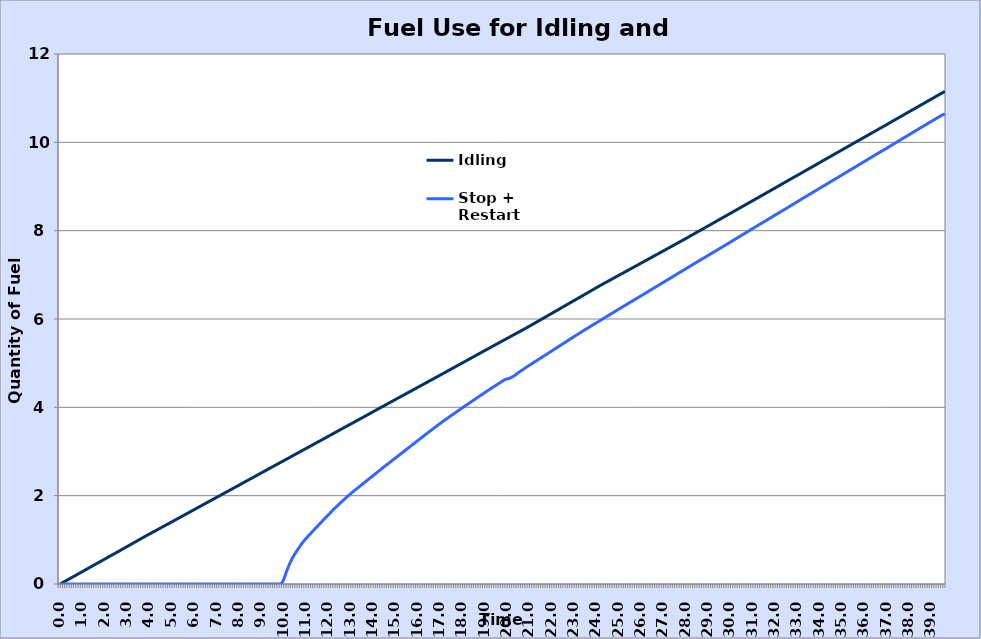
| Category | Idling | Stop + Restart |
|---|---|---|
| 0.0 | 0 | 0 |
| 0.1 | 0.028 | 0 |
| 0.2 | 0.056 | 0 |
| 0.3 | 0.084 | 0 |
| 0.4 | 0.112 | 0 |
| 0.5 | 0.14 | 0 |
| 0.6 | 0.168 | 0 |
| 0.7 | 0.196 | 0 |
| 0.8 | 0.225 | 0 |
| 0.9 | 0.253 | 0 |
| 1.0 | 0.282 | 0 |
| 1.1 | 0.31 | 0 |
| 1.2 | 0.339 | 0 |
| 1.3 | 0.367 | 0 |
| 1.4 | 0.396 | 0 |
| 1.5 | 0.424 | 0 |
| 1.6 | 0.452 | 0 |
| 1.7 | 0.48 | 0 |
| 1.8 | 0.509 | 0 |
| 1.9 | 0.536 | 0 |
| 2.0 | 0.565 | 0 |
| 2.1 | 0.593 | 0 |
| 2.2 | 0.621 | 0 |
| 2.3 | 0.65 | 0 |
| 2.4 | 0.678 | 0 |
| 2.5 | 0.706 | 0 |
| 2.6 | 0.734 | 0 |
| 2.7 | 0.762 | 0 |
| 2.8 | 0.791 | 0 |
| 2.9 | 0.82 | 0 |
| 3.0 | 0.849 | 0 |
| 3.1 | 0.877 | 0 |
| 3.2 | 0.906 | 0 |
| 3.3 | 0.934 | 0 |
| 3.4 | 0.963 | 0 |
| 3.5 | 0.991 | 0 |
| 3.6 | 1.019 | 0 |
| 3.7 | 1.048 | 0 |
| 3.8 | 1.077 | 0 |
| 3.9 | 1.105 | 0 |
| 4.0 | 1.132 | 0 |
| 4.1 | 1.16 | 0 |
| 4.2 | 1.187 | 0 |
| 4.3 | 1.214 | 0 |
| 4.4 | 1.242 | 0 |
| 4.5 | 1.269 | 0 |
| 4.6 | 1.296 | 0 |
| 4.7 | 1.324 | 0 |
| 4.8 | 1.352 | 0 |
| 4.9 | 1.379 | 0 |
| 5.0 | 1.407 | 0 |
| 5.1 | 1.435 | 0 |
| 5.2 | 1.462 | 0 |
| 5.3 | 1.49 | 0 |
| 5.4 | 1.517 | 0 |
| 5.5 | 1.545 | 0 |
| 5.6 | 1.572 | 0 |
| 5.7 | 1.6 | 0 |
| 5.8 | 1.628 | 0 |
| 5.9 | 1.656 | 0 |
| 6.0 | 1.684 | 0 |
| 6.1 | 1.712 | 0 |
| 6.2 | 1.739 | 0 |
| 6.3 | 1.767 | 0 |
| 6.4 | 1.794 | 0 |
| 6.50000000000001 | 1.822 | 0 |
| 6.6 | 1.85 | 0 |
| 6.7 | 1.878 | 0 |
| 6.80000000000001 | 1.905 | 0 |
| 6.90000000000001 | 1.932 | 0 |
| 7.00000000000001 | 1.96 | 0 |
| 7.1 | 1.988 | 0 |
| 7.20000000000001 | 2.015 | 0 |
| 7.30000000000001 | 2.043 | 0 |
| 7.40000000000001 | 2.07 | 0 |
| 7.50000000000001 | 2.098 | 0 |
| 7.60000000000001 | 2.126 | 0 |
| 7.70000000000001 | 2.153 | 0 |
| 7.80000000000001 | 2.181 | 0 |
| 7.90000000000001 | 2.208 | 0 |
| 8.00000000000001 | 2.236 | 0 |
| 8.10000000000001 | 2.264 | 0 |
| 8.20000000000001 | 2.292 | 0 |
| 8.30000000000001 | 2.32 | 0 |
| 8.40000000000001 | 2.348 | 0 |
| 8.50000000000001 | 2.376 | 0 |
| 8.60000000000001 | 2.403 | 0 |
| 8.70000000000001 | 2.43 | 0 |
| 8.80000000000001 | 2.458 | 0 |
| 8.90000000000001 | 2.485 | 0 |
| 9.00000000000001 | 2.513 | 0 |
| 9.10000000000001 | 2.541 | 0 |
| 9.20000000000001 | 2.569 | 0 |
| 9.30000000000001 | 2.597 | 0 |
| 9.40000000000001 | 2.624 | 0 |
| 9.50000000000001 | 2.652 | 0 |
| 9.60000000000001 | 2.679 | 0 |
| 9.70000000000001 | 2.707 | 0 |
| 9.80000000000001 | 2.735 | 0.001 |
| 9.90000000000001 | 2.762 | 0.006 |
| 10.0 | 2.79 | 0.089 |
| 10.1 | 2.817 | 0.237 |
| 10.2 | 2.845 | 0.37 |
| 10.3 | 2.872 | 0.488 |
| 10.4 | 2.901 | 0.59 |
| 10.5 | 2.928 | 0.676 |
| 10.6 | 2.956 | 0.754 |
| 10.7 | 2.984 | 0.83 |
| 10.8 | 3.011 | 0.902 |
| 10.9 | 3.039 | 0.968 |
| 11.0 | 3.066 | 1.027 |
| 11.1 | 3.094 | 1.083 |
| 11.2 | 3.121 | 1.136 |
| 11.3 | 3.149 | 1.19 |
| 11.4 | 3.177 | 1.245 |
| 11.5 | 3.205 | 1.299 |
| 11.6 | 3.232 | 1.353 |
| 11.7 | 3.26 | 1.406 |
| 11.8 | 3.287 | 1.459 |
| 11.9 | 3.315 | 1.511 |
| 12.0 | 3.343 | 1.564 |
| 12.1 | 3.371 | 1.615 |
| 12.2 | 3.399 | 1.666 |
| 12.3 | 3.427 | 1.717 |
| 12.4 | 3.455 | 1.766 |
| 12.5 | 3.482 | 1.815 |
| 12.6 | 3.51 | 1.863 |
| 12.7 | 3.538 | 1.91 |
| 12.8 | 3.565 | 1.955 |
| 12.9 | 3.592 | 1.999 |
| 13.0 | 3.62 | 2.042 |
| 13.1 | 3.647 | 2.085 |
| 13.2 | 3.675 | 2.126 |
| 13.3 | 3.703 | 2.167 |
| 13.4 | 3.731 | 2.208 |
| 13.5 | 3.758 | 2.249 |
| 13.6 | 3.786 | 2.289 |
| 13.7 | 3.814 | 2.33 |
| 13.8 | 3.842 | 2.37 |
| 13.9 | 3.87 | 2.411 |
| 14.0 | 3.898 | 2.451 |
| 14.1 | 3.925 | 2.492 |
| 14.2 | 3.953 | 2.533 |
| 14.3 | 3.981 | 2.573 |
| 14.4 | 4.009 | 2.612 |
| 14.5 | 4.036 | 2.652 |
| 14.6 | 4.064 | 2.692 |
| 14.7 | 4.091 | 2.731 |
| 14.8 | 4.119 | 2.771 |
| 14.9 | 4.147 | 2.81 |
| 15.0 | 4.174 | 2.85 |
| 15.1 | 4.202 | 2.889 |
| 15.2 | 4.23 | 2.929 |
| 15.3 | 4.258 | 2.968 |
| 15.4 | 4.285 | 3.007 |
| 15.5 | 4.313 | 3.047 |
| 15.6 | 4.34 | 3.087 |
| 15.7 | 4.367 | 3.126 |
| 15.8 | 4.395 | 3.166 |
| 15.9 | 4.423 | 3.205 |
| 16.0 | 4.45 | 3.244 |
| 16.1 | 4.478 | 3.284 |
| 16.2 | 4.506 | 3.323 |
| 16.3 | 4.533 | 3.363 |
| 16.4 | 4.561 | 3.402 |
| 16.5 | 4.588 | 3.44 |
| 16.6 | 4.616 | 3.479 |
| 16.7 | 4.643 | 3.518 |
| 16.8 | 4.671 | 3.557 |
| 16.9 | 4.699 | 3.595 |
| 17.0 | 4.727 | 3.632 |
| 17.1 | 4.754 | 3.668 |
| 17.2 | 4.783 | 3.704 |
| 17.3 | 4.81 | 3.741 |
| 17.4 | 4.838 | 3.777 |
| 17.5 | 4.866 | 3.812 |
| 17.6 | 4.893 | 3.847 |
| 17.7 | 4.922 | 3.883 |
| 17.8 | 4.95 | 3.918 |
| 17.9 | 4.977 | 3.953 |
| 18.0 | 5.005 | 3.988 |
| 18.1 | 5.033 | 4.023 |
| 18.2 | 5.061 | 4.058 |
| 18.3 | 5.088 | 4.092 |
| 18.4 | 5.116 | 4.126 |
| 18.5 | 5.144 | 4.161 |
| 18.6 | 5.172 | 4.195 |
| 18.7 | 5.199 | 4.229 |
| 18.8 | 5.227 | 4.264 |
| 18.9 | 5.255 | 4.297 |
| 19.0 | 5.283 | 4.331 |
| 19.1 | 5.311 | 4.365 |
| 19.2 | 5.338 | 4.399 |
| 19.3 | 5.366 | 4.432 |
| 19.4 | 5.394 | 4.465 |
| 19.5 | 5.421 | 4.497 |
| 19.6 | 5.449 | 4.53 |
| 19.7 | 5.477 | 4.562 |
| 19.8 | 5.504 | 4.594 |
| 19.9 | 5.532 | 4.627 |
| 20.0 | 5.559 | 4.643 |
| 20.1 | 5.587 | 4.655 |
| 20.2 | 5.614 | 4.679 |
| 20.3 | 5.641 | 4.707 |
| 20.4 | 5.669 | 4.742 |
| 20.5 | 5.697 | 4.784 |
| 20.6 | 5.724 | 4.818 |
| 20.7 | 5.751 | 4.848 |
| 20.8 | 5.779 | 4.885 |
| 20.9 | 5.806 | 4.919 |
| 21.0 | 5.835 | 4.952 |
| 21.1 | 5.864 | 4.985 |
| 21.2 | 5.893 | 5.017 |
| 21.3 | 5.923 | 5.049 |
| 21.4 | 5.952 | 5.081 |
| 21.5 | 5.981 | 5.113 |
| 21.6 | 6.01 | 5.146 |
| 21.7 | 6.039 | 5.178 |
| 21.8 | 6.068 | 5.21 |
| 21.9 | 6.097 | 5.243 |
| 22.0 | 6.126 | 5.275 |
| 22.1 | 6.155 | 5.308 |
| 22.2 | 6.184 | 5.341 |
| 22.3000000000001 | 6.213 | 5.373 |
| 22.4 | 6.242 | 5.405 |
| 22.5 | 6.271 | 5.438 |
| 22.6000000000001 | 6.3 | 5.47 |
| 22.7 | 6.33 | 5.503 |
| 22.8000000000001 | 6.359 | 5.536 |
| 22.9000000000001 | 6.388 | 5.568 |
| 23.0000000000001 | 6.417 | 5.6 |
| 23.1000000000001 | 6.445 | 5.632 |
| 23.2000000000001 | 6.474 | 5.664 |
| 23.3000000000001 | 6.504 | 5.696 |
| 23.4000000000001 | 6.533 | 5.728 |
| 23.5000000000001 | 6.562 | 5.759 |
| 23.6000000000001 | 6.591 | 5.79 |
| 23.7000000000001 | 6.62 | 5.821 |
| 23.8000000000001 | 6.649 | 5.852 |
| 23.9000000000001 | 6.678 | 5.883 |
| 24.0000000000001 | 6.708 | 5.914 |
| 24.1000000000001 | 6.737 | 5.944 |
| 24.2000000000001 | 6.766 | 5.975 |
| 24.3000000000001 | 6.794 | 6.006 |
| 24.4000000000001 | 6.821 | 6.037 |
| 24.5000000000001 | 6.849 | 6.068 |
| 24.6000000000001 | 6.876 | 6.098 |
| 24.7000000000001 | 6.904 | 6.129 |
| 24.8000000000001 | 6.932 | 6.16 |
| 24.9000000000001 | 6.96 | 6.191 |
| 25.0000000000001 | 6.987 | 6.221 |
| 25.1000000000001 | 7.015 | 6.252 |
| 25.2000000000001 | 7.042 | 6.282 |
| 25.3000000000001 | 7.07 | 6.313 |
| 25.4000000000001 | 7.098 | 6.343 |
| 25.5000000000001 | 7.125 | 6.373 |
| 25.6000000000001 | 7.153 | 6.404 |
| 25.7000000000001 | 7.18 | 6.434 |
| 25.8000000000001 | 7.208 | 6.465 |
| 25.9000000000001 | 7.236 | 6.495 |
| 26.0000000000001 | 7.264 | 6.525 |
| 26.1000000000001 | 7.292 | 6.556 |
| 26.2000000000001 | 7.32 | 6.586 |
| 26.3000000000001 | 7.347 | 6.616 |
| 26.4000000000001 | 7.375 | 6.647 |
| 26.5000000000001 | 7.403 | 6.678 |
| 26.6000000000001 | 7.431 | 6.708 |
| 26.7000000000001 | 7.458 | 6.738 |
| 26.8000000000001 | 7.486 | 6.769 |
| 26.9000000000001 | 7.514 | 6.8 |
| 27.0000000000001 | 7.541 | 6.831 |
| 27.1000000000001 | 7.569 | 6.861 |
| 27.2000000000001 | 7.597 | 6.891 |
| 27.3000000000001 | 7.625 | 6.922 |
| 27.4000000000001 | 7.653 | 6.953 |
| 27.5000000000001 | 7.681 | 6.983 |
| 27.6000000000001 | 7.709 | 7.014 |
| 27.7000000000001 | 7.737 | 7.044 |
| 27.8000000000001 | 7.765 | 7.075 |
| 27.9000000000001 | 7.792 | 7.105 |
| 28.0000000000001 | 7.82 | 7.135 |
| 28.1000000000001 | 7.849 | 7.166 |
| 28.2000000000001 | 7.877 | 7.197 |
| 28.3000000000001 | 7.906 | 7.227 |
| 28.4000000000001 | 7.935 | 7.257 |
| 28.5000000000001 | 7.964 | 7.288 |
| 28.6000000000001 | 7.992 | 7.319 |
| 28.7000000000001 | 8.02 | 7.349 |
| 28.8000000000001 | 8.049 | 7.379 |
| 28.9000000000001 | 8.077 | 7.409 |
| 29.0000000000001 | 8.106 | 7.439 |
| 29.1000000000001 | 8.135 | 7.469 |
| 29.2000000000001 | 8.163 | 7.499 |
| 29.3000000000001 | 8.192 | 7.529 |
| 29.4000000000001 | 8.221 | 7.559 |
| 29.5000000000001 | 8.249 | 7.59 |
| 29.6000000000002 | 8.278 | 7.62 |
| 29.7000000000002 | 8.307 | 7.651 |
| 29.8000000000002 | 8.335 | 7.681 |
| 29.9000000000002 | 8.364 | 7.711 |
| 30.0000000000002 | 8.392 | 7.742 |
| 30.1000000000002 | 8.421 | 7.772 |
| 30.2000000000002 | 8.45 | 7.803 |
| 30.3000000000002 | 8.478 | 7.834 |
| 30.4000000000002 | 8.507 | 7.864 |
| 30.5000000000002 | 8.536 | 7.895 |
| 30.6000000000002 | 8.565 | 7.926 |
| 30.7000000000002 | 8.594 | 7.956 |
| 30.8000000000002 | 8.622 | 7.986 |
| 30.9000000000002 | 8.651 | 8.017 |
| 31.0000000000002 | 8.68 | 8.048 |
| 31.1000000000002 | 8.708 | 8.078 |
| 31.2000000000002 | 8.737 | 8.109 |
| 31.3000000000002 | 8.765 | 8.14 |
| 31.4000000000002 | 8.794 | 8.17 |
| 31.5000000000002 | 8.823 | 8.2 |
| 31.6000000000002 | 8.852 | 8.23 |
| 31.7000000000002 | 8.88 | 8.26 |
| 31.8000000000002 | 8.909 | 8.291 |
| 31.9000000000002 | 8.937 | 8.322 |
| 32.0000000000002 | 8.967 | 8.353 |
| 32.1000000000002 | 8.996 | 8.383 |
| 32.2000000000002 | 9.025 | 8.413 |
| 32.3000000000002 | 9.054 | 8.443 |
| 32.4000000000002 | 9.083 | 8.473 |
| 32.5000000000002 | 9.111 | 8.503 |
| 32.6000000000002 | 9.14 | 8.534 |
| 32.7000000000002 | 9.169 | 8.565 |
| 32.8000000000002 | 9.198 | 8.596 |
| 32.9000000000002 | 9.226 | 8.626 |
| 33.0000000000002 | 9.254 | 8.657 |
| 33.1000000000002 | 9.283 | 8.688 |
| 33.2000000000002 | 9.312 | 8.719 |
| 33.3000000000002 | 9.34 | 8.749 |
| 33.4000000000002 | 9.369 | 8.78 |
| 33.5000000000002 | 9.398 | 8.81 |
| 33.6000000000002 | 9.427 | 8.84 |
| 33.7000000000002 | 9.455 | 8.87 |
| 33.8000000000002 | 9.484 | 8.9 |
| 33.9000000000002 | 9.513 | 8.931 |
| 34.0000000000002 | 9.543 | 8.961 |
| 34.1000000000002 | 9.571 | 8.991 |
| 34.2000000000002 | 9.6 | 9.021 |
| 34.3000000000002 | 9.629 | 9.051 |
| 34.4000000000002 | 9.658 | 9.082 |
| 34.5000000000002 | 9.687 | 9.112 |
| 34.6000000000002 | 9.715 | 9.142 |
| 34.7000000000002 | 9.744 | 9.172 |
| 34.8000000000002 | 9.772 | 9.202 |
| 34.9000000000002 | 9.801 | 9.233 |
| 35.0000000000002 | 9.83 | 9.264 |
| 35.1000000000002 | 9.859 | 9.295 |
| 35.2000000000002 | 9.888 | 9.325 |
| 35.3000000000002 | 9.916 | 9.355 |
| 35.4000000000002 | 9.945 | 9.385 |
| 35.5000000000002 | 9.974 | 9.415 |
| 35.6000000000002 | 10.002 | 9.446 |
| 35.7000000000002 | 10.03 | 9.477 |
| 35.8000000000002 | 10.059 | 9.507 |
| 35.9000000000002 | 10.088 | 9.537 |
| 36.0000000000002 | 10.116 | 9.567 |
| 36.1000000000002 | 10.145 | 9.597 |
| 36.2000000000002 | 10.174 | 9.628 |
| 36.3000000000002 | 10.203 | 9.659 |
| 36.4000000000002 | 10.231 | 9.689 |
| 36.5000000000002 | 10.26 | 9.719 |
| 36.6000000000003 | 10.289 | 9.749 |
| 36.7000000000003 | 10.317 | 9.779 |
| 36.8000000000003 | 10.346 | 9.809 |
| 36.9000000000003 | 10.374 | 9.839 |
| 37.0000000000003 | 10.403 | 9.869 |
| 37.1000000000003 | 10.432 | 9.899 |
| 37.2000000000003 | 10.461 | 9.929 |
| 37.3000000000003 | 10.49 | 9.96 |
| 37.4000000000003 | 10.519 | 9.991 |
| 37.5000000000003 | 10.548 | 10.021 |
| 37.6000000000003 | 10.577 | 10.052 |
| 37.7000000000003 | 10.605 | 10.083 |
| 37.8000000000003 | 10.635 | 10.113 |
| 37.9000000000003 | 10.664 | 10.143 |
| 38.0000000000003 | 10.692 | 10.174 |
| 38.1000000000003 | 10.721 | 10.204 |
| 38.2000000000003 | 10.75 | 10.235 |
| 38.3000000000003 | 10.779 | 10.265 |
| 38.4000000000003 | 10.808 | 10.295 |
| 38.5000000000003 | 10.836 | 10.325 |
| 38.6000000000003 | 10.865 | 10.355 |
| 38.7000000000003 | 10.894 | 10.386 |
| 38.8000000000003 | 10.923 | 10.416 |
| 38.9000000000003 | 10.952 | 10.446 |
| 39.0000000000003 | 10.981 | 10.476 |
| 39.1000000000003 | 11.01 | 10.506 |
| 39.2000000000003 | 11.039 | 10.536 |
| 39.3000000000003 | 11.067 | 10.566 |
| 39.4000000000003 | 11.096 | 10.596 |
| 39.5000000000003 | 11.125 | 10.626 |
| 39.6000000000003 | 11.154 | 10.641 |